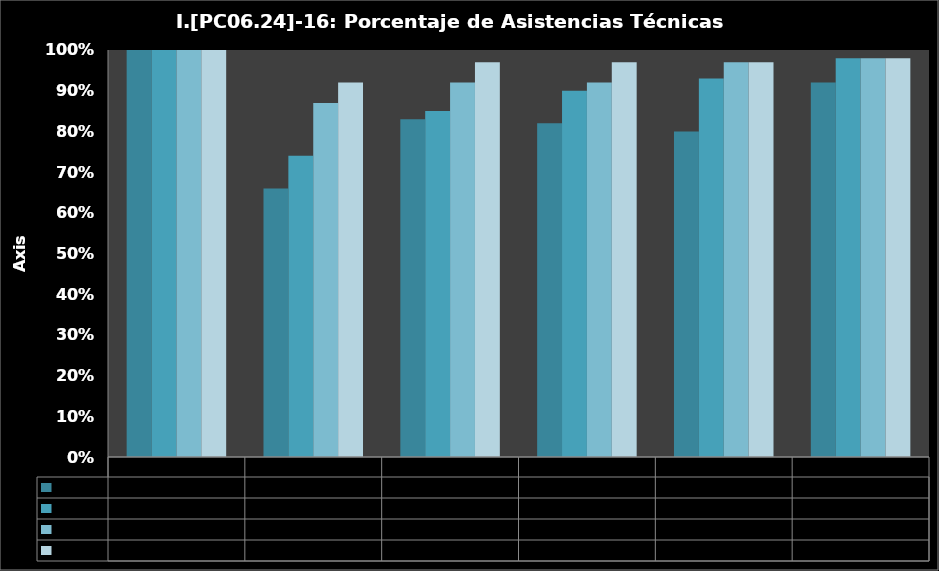
| Category | 2 DÍAS | 5 DÍAS | 10 DÍAS | 20 DÍAS |
|---|---|---|---|---|
| 0 | 1 | 1 | 1 | 1 |
| 1 | 0.66 | 0.74 | 0.87 | 0.92 |
| 2 | 0.83 | 0.85 | 0.92 | 0.97 |
| 3 | 0.82 | 0.9 | 0.92 | 0.97 |
| 4 | 0.8 | 0.93 | 0.97 | 0.97 |
| 5 | 0.92 | 0.98 | 0.98 | 0.98 |